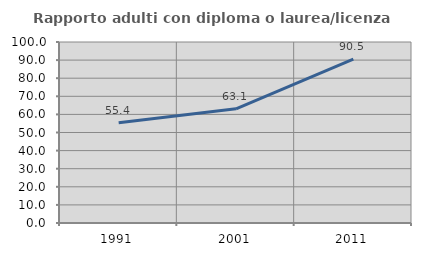
| Category | Rapporto adulti con diploma o laurea/licenza media  |
|---|---|
| 1991.0 | 55.39 |
| 2001.0 | 63.112 |
| 2011.0 | 90.504 |